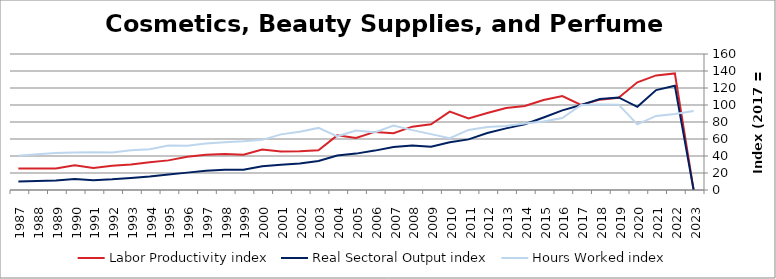
| Category | Labor Productivity index | Real Sectoral Output index | Hours Worked index |
|---|---|---|---|
| 2023.0 | 0 | 0 | 93.049 |
| 2022.0 | 137.137 | 122.584 | 89.388 |
| 2021.0 | 134.844 | 117.578 | 87.196 |
| 2020.0 | 126.737 | 97.806 | 77.173 |
| 2019.0 | 108.445 | 108.928 | 100.445 |
| 2018.0 | 106.314 | 107.049 | 100.691 |
| 2017.0 | 100 | 100 | 100 |
| 2016.0 | 110.497 | 93.654 | 84.757 |
| 2015.0 | 105.967 | 85.289 | 80.486 |
| 2014.0 | 98.87 | 77.369 | 78.253 |
| 2013.0 | 96.418 | 72.482 | 75.174 |
| 2012.0 | 90.543 | 67.027 | 74.028 |
| 2011.0 | 84.293 | 59.542 | 70.638 |
| 2010.0 | 92.14 | 56.073 | 60.856 |
| 2009.0 | 77.281 | 50.801 | 65.735 |
| 2008.0 | 74.505 | 52.463 | 70.415 |
| 2007.0 | 66.785 | 50.598 | 75.763 |
| 2006.0 | 68.347 | 46.34 | 67.801 |
| 2005.0 | 61.151 | 42.806 | 70.001 |
| 2004.0 | 64.256 | 40.573 | 63.143 |
| 2003.0 | 46.786 | 34.182 | 73.06 |
| 2002.0 | 45.6 | 31.285 | 68.607 |
| 2001.0 | 45.331 | 29.674 | 65.461 |
| 2000.0 | 47.519 | 28.03 | 58.986 |
| 1999.0 | 41.569 | 23.809 | 57.277 |
| 1998.0 | 42.44 | 23.799 | 56.076 |
| 1997.0 | 41.386 | 22.587 | 54.577 |
| 1996.0 | 39.196 | 20.444 | 52.158 |
| 1995.0 | 34.852 | 18.25 | 52.366 |
| 1994.0 | 32.768 | 15.744 | 48.046 |
| 1993.0 | 30.069 | 14.047 | 46.715 |
| 1992.0 | 28.417 | 12.546 | 44.148 |
| 1991.0 | 25.977 | 11.542 | 44.434 |
| 1990.0 | 29.175 | 12.847 | 44.035 |
| 1989.0 | 25.324 | 11.047 | 43.622 |
| 1988.0 | 25.377 | 10.65 | 41.966 |
| 1987.0 | 25.218 | 10.136 | 40.192 |